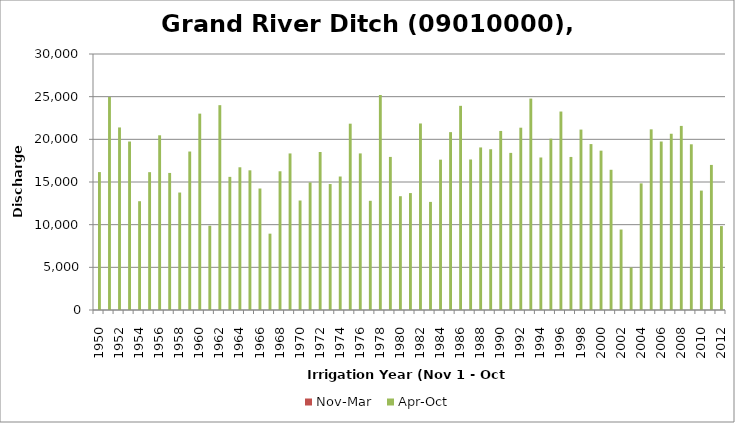
| Category | Nov-Mar  | Apr-Oct |
|---|---|---|
| 1950.0 | 0 | 16161.76 |
| 1951.0 | 0 | 24962.35 |
| 1952.0 | 0 | 21392.84 |
| 1953.0 | 0 | 19744.35 |
| 1954.0 | 0 | 12748.54 |
| 1955.0 | 0 | 16152.24 |
| 1956.0 | 0 | 20472.3 |
| 1957.0 | 0 | 16061.59 |
| 1958.0 | 0 | 13766.09 |
| 1959.0 | 0 | 18571.51 |
| 1960.0 | 0 | 23011.56 |
| 1961.0 | 0 | 9875.83 |
| 1962.0 | 0 | 24003.32 |
| 1963.0 | 0 | 15601.42 |
| 1964.0 | 0 | 16724.27 |
| 1965.0 | 0 | 16368.24 |
| 1966.0 | 0 | 14237.96 |
| 1967.0 | 0 | 8946.37 |
| 1968.0 | 0 | 16256.77 |
| 1969.0 | 0 | 18346.4 |
| 1970.0 | 0 | 12829.42 |
| 1971.0 | 0 | 14953.6 |
| 1972.0 | 0 | 18517.96 |
| 1973.0 | 0 | 14761.21 |
| 1974.0 | 0 | 15643.27 |
| 1975.0 | 0 | 21834.96 |
| 1976.0 | 0 | 18349.95 |
| 1977.0 | 0 | 12796.94 |
| 1978.0 | 0 | 25195.6 |
| 1979.0 | 0 | 17939.17 |
| 1980.0 | 0 | 13334.47 |
| 1981.0 | 0 | 13702.61 |
| 1982.0 | 0 | 21857.77 |
| 1983.0 | 0 | 12667.62 |
| 1984.0 | 0 | 17618.04 |
| 1985.0 | 0 | 20844.79 |
| 1986.0 | 0 | 23925.77 |
| 1987.0 | 0 | 17637.68 |
| 1988.0 | 0 | 19049.44 |
| 1989.0 | 0 | 18837.98 |
| 1990.0 | 0 | 20982.83 |
| 1991.0 | 0 | 18412.35 |
| 1992.0 | 0 | 21363.28 |
| 1993.0 | 0 | 24774.27 |
| 1994.0 | 0 | 17872.39 |
| 1995.0 | 0 | 20077.38 |
| 1996.0 | 0 | 23258.32 |
| 1997.0 | 0 | 17936.06 |
| 1998.0 | 0 | 21143.09 |
| 1999.0 | 0 | 19444.04 |
| 2000.0 | 0 | 18673.26 |
| 2001.0 | 0 | 16432.54 |
| 2002.0 | 0 | 9430.52 |
| 2003.0 | 0 | 4979.94 |
| 2004.0 | 0 | 14837.4 |
| 2005.0 | 0 | 21170.8 |
| 2006.0 | 0 | 19745.74 |
| 2007.0 | 0 | 20653.59 |
| 2008.0 | 0 | 21572.82 |
| 2009.0 | 0 | 19418.39 |
| 2010.0 | 0 | 13993.07 |
| 2011.0 | 0 | 17001.37 |
| 2012.0 | 0 | 9832.41 |